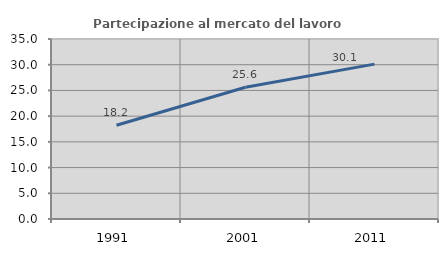
| Category | Partecipazione al mercato del lavoro  femminile |
|---|---|
| 1991.0 | 18.222 |
| 2001.0 | 25.616 |
| 2011.0 | 30.114 |